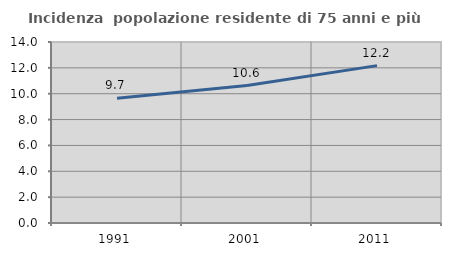
| Category | Incidenza  popolazione residente di 75 anni e più |
|---|---|
| 1991.0 | 9.657 |
| 2001.0 | 10.628 |
| 2011.0 | 12.172 |